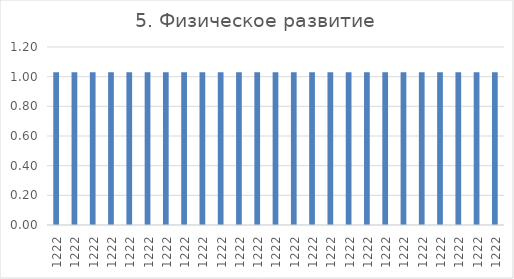
| Category | Series 0 |
|---|---|
| 1222.0 | 1.03 |
| 1222.0 | 1.03 |
| 1222.0 | 1.03 |
| 1222.0 | 1.03 |
| 1222.0 | 1.03 |
| 1222.0 | 1.03 |
| 1222.0 | 1.03 |
| 1222.0 | 1.03 |
| 1222.0 | 1.03 |
| 1222.0 | 1.03 |
| 1222.0 | 1.03 |
| 1222.0 | 1.03 |
| 1222.0 | 1.03 |
| 1222.0 | 1.03 |
| 1222.0 | 1.03 |
| 1222.0 | 1.03 |
| 1222.0 | 1.03 |
| 1222.0 | 1.03 |
| 1222.0 | 1.03 |
| 1222.0 | 1.03 |
| 1222.0 | 1.03 |
| 1222.0 | 1.03 |
| 1222.0 | 1.03 |
| 1222.0 | 1.03 |
| 1222.0 | 1.03 |